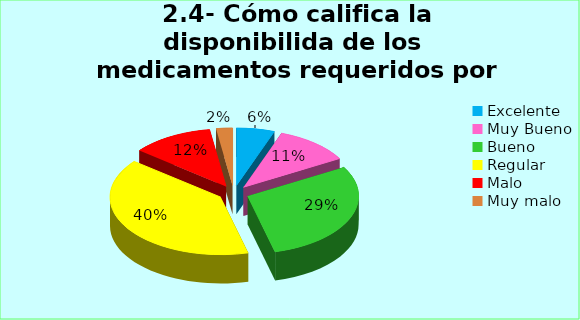
| Category | Series 0 |
|---|---|
| Excelente | 0.056 |
| Muy Bueno | 0.111 |
| Bueno  | 0.294 |
| Regular  | 0.397 |
| Malo  | 0.119 |
| Muy malo  | 0.024 |